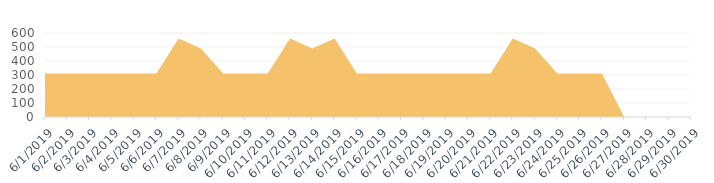
| Category | Services |
|---|---|
| 43617.0 | 310 |
| 43618.0 | 310 |
| 43619.0 | 310 |
| 43620.0 | 310 |
| 43621.0 | 310 |
| 43622.0 | 310 |
| 43623.0 | 560 |
| 43624.0 | 490 |
| 43625.0 | 310 |
| 43626.0 | 310 |
| 43627.0 | 310 |
| 43628.0 | 560 |
| 43629.0 | 490 |
| 43630.0 | 560 |
| 43631.0 | 310 |
| 43632.0 | 310 |
| 43633.0 | 310 |
| 43634.0 | 310 |
| 43635.0 | 310 |
| 43636.0 | 310 |
| 43637.0 | 310 |
| 43638.0 | 560 |
| 43639.0 | 490 |
| 43640.0 | 310 |
| 43641.0 | 310 |
| 43642.0 | 310 |
| 43643.0 | 0 |
| 43644.0 | 0 |
| 43645.0 | 0 |
| 43646.0 | 0 |